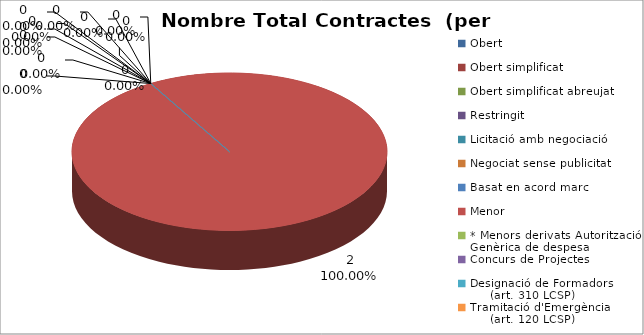
| Category | Nombre Total Contractes |
|---|---|
| Obert | 0 |
| Obert simplificat | 0 |
| Obert simplificat abreujat | 0 |
| Restringit | 0 |
| Licitació amb negociació | 0 |
| Negociat sense publicitat | 0 |
| Basat en acord marc | 0 |
| Menor | 2 |
| * Menors derivats Autorització Genèrica de despesa | 0 |
| Concurs de Projectes | 0 |
| Designació de Formadors
     (art. 310 LCSP) | 0 |
| Tramitació d'Emergència
     (art. 120 LCSP) | 0 |